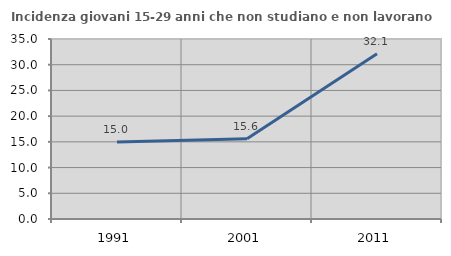
| Category | Incidenza giovani 15-29 anni che non studiano e non lavorano  |
|---|---|
| 1991.0 | 14.968 |
| 2001.0 | 15.625 |
| 2011.0 | 32.143 |